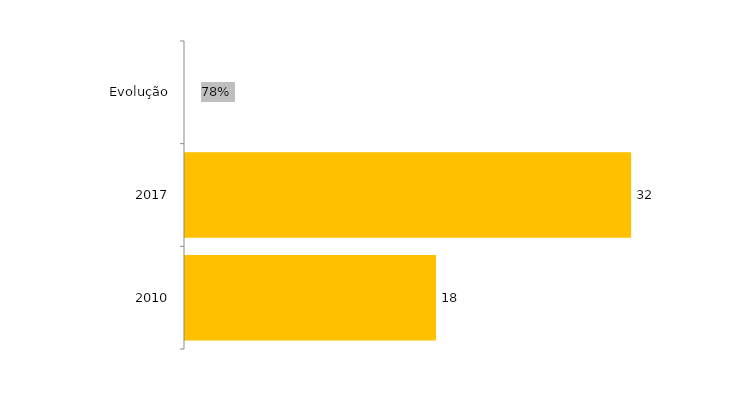
| Category | Evolução Vagas Ofertadas |
|---|---|
| 2010 | 18 |
| 2017 | 32 |
| Evolução | 0.778 |